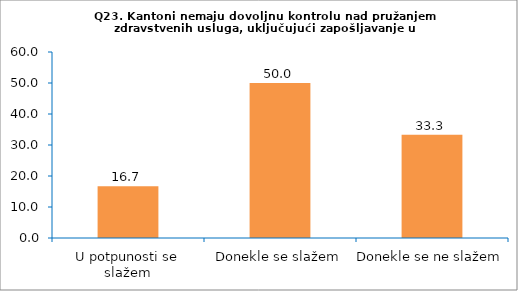
| Category | Series 0 |
|---|---|
| U potpunosti se slažem | 16.667 |
| Donekle se slažem | 50 |
| Donekle se ne slažem | 33.333 |